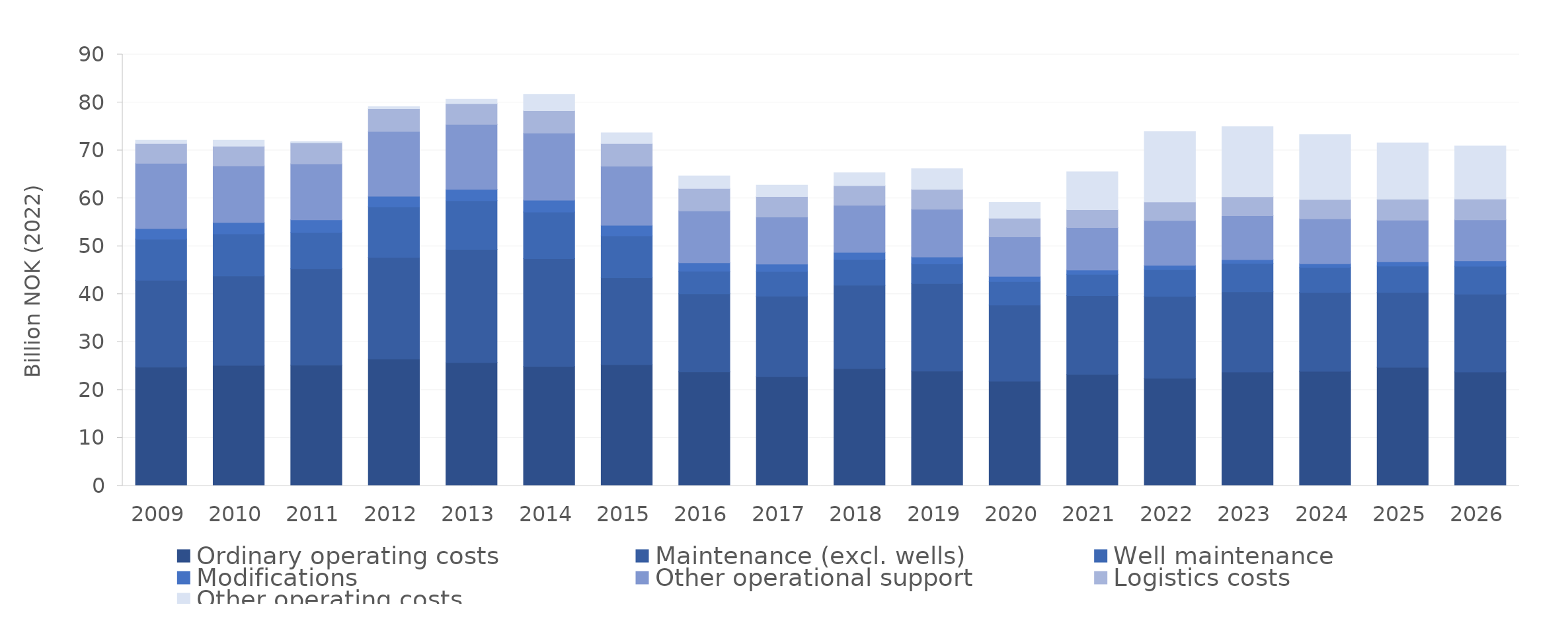
| Category | Ordinary operating costs | Maintenance (excl. wells) | Well maintenance | Modifications  | Other operational support  | Logistics costs | Other operating costs |
|---|---|---|---|---|---|---|---|
| 2009.0 | 24.774 | 18.14 | 8.567 | 2.205 | 13.614 | 4.137 | 0.684 |
| 2010.0 | 25.15 | 18.637 | 8.795 | 2.374 | 11.823 | 4.088 | 1.262 |
| 2011.0 | 25.191 | 20.135 | 7.529 | 2.658 | 11.683 | 4.415 | 0.221 |
| 2012.0 | 26.473 | 21.206 | 10.562 | 2.201 | 13.507 | 4.745 | 0.429 |
| 2013.0 | 25.752 | 23.602 | 10.136 | 2.381 | 13.557 | 4.328 | 0.919 |
| 2014.0 | 24.928 | 22.483 | 9.702 | 2.489 | 13.98 | 4.689 | 3.425 |
| 2015.0 | 25.288 | 18.129 | 8.757 | 2.182 | 12.336 | 4.747 | 2.222 |
| 2016.0 | 23.811 | 16.273 | 4.709 | 1.764 | 10.828 | 4.664 | 2.613 |
| 2017.0 | 22.766 | 16.834 | 5.108 | 1.583 | 9.795 | 4.29 | 2.373 |
| 2018.0 | 24.472 | 17.409 | 5.362 | 1.471 | 9.826 | 4.115 | 2.657 |
| 2019.0 | 23.931 | 18.285 | 4.105 | 1.432 | 9.975 | 4.147 | 4.306 |
| 2020.0 | 21.852 | 15.888 | 4.88 | 1.098 | 8.249 | 3.89 | 3.277 |
| 2021.0 | 23.264 | 16.416 | 4.456 | 0.91 | 8.842 | 3.724 | 7.923 |
| 2022.0 | 22.48 | 17.071 | 5.537 | 0.931 | 9.347 | 3.879 | 14.705 |
| 2023.0 | 23.758 | 16.74 | 5.921 | 0.8 | 9.167 | 3.951 | 14.6 |
| 2024.0 | 23.903 | 16.438 | 5.204 | 0.809 | 9.347 | 4.055 | 13.541 |
| 2025.0 | 24.733 | 15.645 | 5.49 | 0.904 | 8.653 | 4.378 | 11.76 |
| 2026.0 | 23.788 | 16.224 | 5.8 | 1.162 | 8.535 | 4.353 | 11.047 |